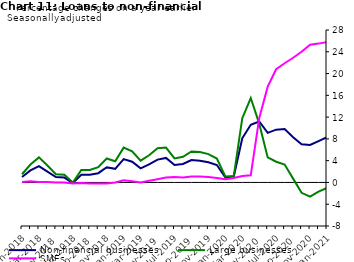
| Category | zero | Non-financial businesses | Large businesses | SMEs |
|---|---|---|---|---|
| Jan-2018 | 0 | 1 | 1.5 | 0.1 |
| Feb-2018 | 0 | 2.2 | 3.3 | 0.2 |
| Mar-2018 | 0 | 3 | 4.6 | 0.1 |
| Apr-2018 | 0 | 2 | 3.1 | 0.1 |
| May-2018 | 0 | 1 | 1.5 | 0 |
| Jun-2018 | 0 | 0.9 | 1.4 | 0 |
| Jul-2018 | 0 | -0.1 | 0 | -0.2 |
| Aug-2018 | 0 | 1.4 | 2.3 | -0.1 |
| Sep-2018 | 0 | 1.4 | 2.3 | -0.2 |
| Oct-2018 | 0 | 1.7 | 2.8 | -0.2 |
| Nov-2018 | 0 | 2.8 | 4.4 | -0.2 |
| Dec-2018 | 0 | 2.5 | 3.9 | 0 |
| Jan-2019 | 0 | 4.3 | 6.4 | 0.4 |
| Feb-2019 | 0 | 3.8 | 5.7 | 0.2 |
| Mar-2019 | 0 | 2.6 | 4 | 0 |
| Apr-2019 | 0 | 3.3 | 5 | 0.3 |
| May-2019 | 0 | 4.2 | 6.3 | 0.6 |
| Jun-2019 | 0 | 4.5 | 6.4 | 0.9 |
| Jul-2019 | 0 | 3.2 | 4.4 | 1 |
| Aug-2019 | 0 | 3.4 | 4.7 | 0.9 |
| Sep-2019 | 0 | 4.1 | 5.7 | 1.1 |
| Oct-2019 | 0 | 4 | 5.6 | 1.1 |
| Nov-2019 | 0 | 3.7 | 5.2 | 1 |
| Dec-2019 | 0 | 3.2 | 4.4 | 0.8 |
| Jan-2020 | 0 | 0.9 | 1.1 | 0.6 |
| Feb-2020 | 0 | 1.1 | 1.2 | 0.8 |
| Mar-2020 | 0 | 8.1 | 11.8 | 1.2 |
| Apr-2020 | 0 | 10.6 | 15.5 | 1.3 |
| May-2020 | 0 | 11.2 | 10.8 | 11.8 |
| Jun-2020 | 0 | 9.1 | 4.6 | 17.6 |
| Jul-2020 | 0 | 9.7 | 3.8 | 20.8 |
| Aug-2020 | 0 | 9.8 | 3.3 | 21.9 |
| Sep-2020 | 0 | 8.3 | 0.7 | 22.9 |
| Oct-2020 | 0 | 7 | -1.9 | 24 |
| Nov-2020 | 0 | 6.9 | -2.6 | 25.3 |
| Dec-2020 | 0 | 7.6 | -1.7 | 25.5 |
| Jan-2021 | 0 | 8.3 | -1 | 25.8 |